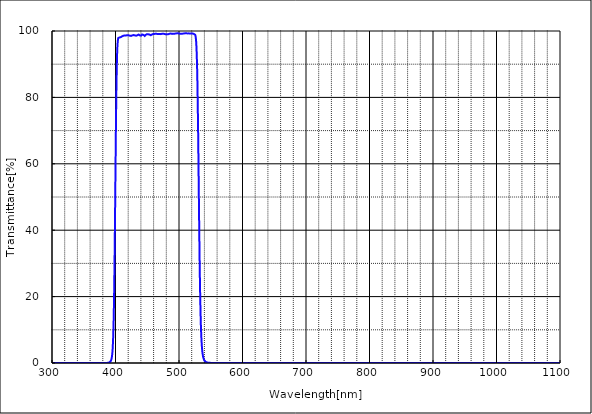
| Category | T% at AOI 0 deg |
|---|---|
| 1100.0 | 0.001 |
| 1099.5 | 0 |
| 1099.0 | 0.001 |
| 1098.5 | 0.003 |
| 1098.0 | 0.001 |
| 1097.5 | 0.001 |
| 1097.0 | 0.002 |
| 1096.5 | 0.002 |
| 1096.0 | 0.002 |
| 1095.5 | 0.003 |
| 1095.0 | 0.002 |
| 1094.5 | 0.003 |
| 1094.0 | 0.002 |
| 1093.5 | 0.002 |
| 1093.0 | 0.002 |
| 1092.5 | 0.002 |
| 1092.0 | 0.002 |
| 1091.5 | 0.002 |
| 1091.0 | 0.002 |
| 1090.5 | 0.001 |
| 1090.0 | 0.003 |
| 1089.5 | 0.002 |
| 1089.0 | 0.002 |
| 1088.5 | 0.002 |
| 1088.0 | 0 |
| 1087.5 | 0.001 |
| 1087.0 | -0.001 |
| 1086.5 | 0.001 |
| 1086.0 | 0.001 |
| 1085.5 | 0.001 |
| 1085.0 | 0 |
| 1084.5 | 0 |
| 1084.0 | 0.002 |
| 1083.5 | 0.001 |
| 1083.0 | 0.001 |
| 1082.5 | 0.001 |
| 1082.0 | 0.001 |
| 1081.5 | 0.001 |
| 1081.0 | 0.001 |
| 1080.5 | 0 |
| 1080.0 | 0.001 |
| 1079.5 | 0 |
| 1079.0 | 0.001 |
| 1078.5 | -0.001 |
| 1078.0 | 0.002 |
| 1077.5 | 0.001 |
| 1077.0 | 0 |
| 1076.5 | 0 |
| 1076.0 | 0 |
| 1075.5 | 0.001 |
| 1075.0 | 0 |
| 1074.5 | 0.001 |
| 1074.0 | 0.001 |
| 1073.5 | -0.001 |
| 1073.0 | 0.001 |
| 1072.5 | 0.001 |
| 1072.0 | 0.002 |
| 1071.5 | 0 |
| 1071.0 | 0.001 |
| 1070.5 | 0 |
| 1070.0 | 0.001 |
| 1069.5 | 0.001 |
| 1069.0 | 0.001 |
| 1068.5 | 0 |
| 1068.0 | 0.001 |
| 1067.5 | 0 |
| 1067.0 | 0.001 |
| 1066.5 | 0.001 |
| 1066.0 | 0.001 |
| 1065.5 | 0.001 |
| 1065.0 | 0 |
| 1064.5 | 0.001 |
| 1064.0 | 0.002 |
| 1063.5 | 0 |
| 1063.0 | 0.001 |
| 1062.5 | -0.001 |
| 1062.0 | 0 |
| 1061.5 | 0 |
| 1061.0 | 0.002 |
| 1060.5 | 0.001 |
| 1060.0 | 0.002 |
| 1059.5 | 0 |
| 1059.0 | -0.002 |
| 1058.5 | 0.001 |
| 1058.0 | 0 |
| 1057.5 | 0 |
| 1057.0 | 0 |
| 1056.5 | 0 |
| 1056.0 | 0.002 |
| 1055.5 | 0.001 |
| 1055.0 | 0 |
| 1054.5 | 0 |
| 1054.0 | 0 |
| 1053.5 | 0.001 |
| 1053.0 | 0 |
| 1052.5 | 0.002 |
| 1052.0 | 0 |
| 1051.5 | 0 |
| 1051.0 | 0.001 |
| 1050.5 | 0 |
| 1050.0 | 0 |
| 1049.5 | 0 |
| 1049.0 | 0.001 |
| 1048.5 | 0.001 |
| 1048.0 | 0 |
| 1047.5 | 0 |
| 1047.0 | 0.001 |
| 1046.5 | 0.001 |
| 1046.0 | 0.001 |
| 1045.5 | 0 |
| 1045.0 | 0.001 |
| 1044.5 | 0.001 |
| 1044.0 | 0.001 |
| 1043.5 | 0.001 |
| 1043.0 | 0.001 |
| 1042.5 | 0 |
| 1042.0 | 0 |
| 1041.5 | 0 |
| 1041.0 | 0 |
| 1040.5 | 0.001 |
| 1040.0 | 0.001 |
| 1039.5 | 0 |
| 1039.0 | 0 |
| 1038.5 | 0 |
| 1038.0 | 0 |
| 1037.5 | 0 |
| 1037.0 | -0.001 |
| 1036.5 | 0 |
| 1036.0 | 0 |
| 1035.5 | 0 |
| 1035.0 | 0 |
| 1034.5 | 0 |
| 1034.0 | 0 |
| 1033.5 | 0.001 |
| 1033.0 | 0.001 |
| 1032.5 | 0 |
| 1032.0 | 0 |
| 1031.5 | 0 |
| 1031.0 | 0 |
| 1030.5 | 0 |
| 1030.0 | 0.001 |
| 1029.5 | 0.002 |
| 1029.0 | -0.001 |
| 1028.5 | 0.001 |
| 1028.0 | 0.001 |
| 1027.5 | 0.001 |
| 1027.0 | 0 |
| 1026.5 | -0.001 |
| 1026.0 | 0.001 |
| 1025.5 | 0.001 |
| 1025.0 | 0 |
| 1024.5 | 0.001 |
| 1024.0 | 0 |
| 1023.5 | 0 |
| 1023.0 | -0.001 |
| 1022.5 | 0 |
| 1022.0 | 0 |
| 1021.5 | 0.001 |
| 1021.0 | 0 |
| 1020.5 | 0 |
| 1020.0 | 0 |
| 1019.5 | 0.001 |
| 1019.0 | 0 |
| 1018.5 | 0 |
| 1018.0 | 0.001 |
| 1017.5 | 0 |
| 1017.0 | 0.001 |
| 1016.5 | 0 |
| 1016.0 | 0 |
| 1015.5 | 0 |
| 1015.0 | 0.001 |
| 1014.5 | 0.002 |
| 1014.0 | 0 |
| 1013.5 | 0.001 |
| 1013.0 | 0.001 |
| 1012.5 | -0.001 |
| 1012.0 | 0 |
| 1011.5 | 0.001 |
| 1011.0 | 0.001 |
| 1010.5 | -0.001 |
| 1010.0 | 0.001 |
| 1009.5 | 0 |
| 1009.0 | -0.001 |
| 1008.5 | 0.001 |
| 1008.0 | 0.001 |
| 1007.5 | 0 |
| 1007.0 | 0.001 |
| 1006.5 | 0.001 |
| 1006.0 | -0.001 |
| 1005.5 | 0 |
| 1005.0 | 0 |
| 1004.5 | 0 |
| 1004.0 | 0.001 |
| 1003.5 | 0 |
| 1003.0 | 0.001 |
| 1002.5 | 0.001 |
| 1002.0 | 0.001 |
| 1001.5 | -0.001 |
| 1001.0 | 0.001 |
| 1000.5 | 0.001 |
| 1000.0 | -0.001 |
| 999.5 | 0 |
| 999.0 | 0 |
| 998.5 | 0 |
| 998.0 | 0.001 |
| 997.5 | 0.001 |
| 997.0 | 0 |
| 996.5 | 0 |
| 996.0 | 0 |
| 995.5 | 0.001 |
| 995.0 | 0 |
| 994.5 | 0.001 |
| 994.0 | 0.001 |
| 993.5 | 0 |
| 993.0 | 0.001 |
| 992.5 | 0.001 |
| 992.0 | 0.001 |
| 991.5 | 0.001 |
| 991.0 | 0 |
| 990.5 | 0.001 |
| 990.0 | 0.001 |
| 989.5 | 0 |
| 989.0 | 0.002 |
| 988.5 | 0.001 |
| 988.0 | -0.001 |
| 987.5 | 0.002 |
| 987.0 | 0.001 |
| 986.5 | 0 |
| 986.0 | -0.001 |
| 985.5 | 0.001 |
| 985.0 | 0.001 |
| 984.5 | -0.001 |
| 984.0 | 0.001 |
| 983.5 | 0.001 |
| 983.0 | -0.001 |
| 982.5 | 0.001 |
| 982.0 | 0.001 |
| 981.5 | 0 |
| 981.0 | 0 |
| 980.5 | 0.001 |
| 980.0 | 0 |
| 979.5 | 0 |
| 979.0 | 0 |
| 978.5 | 0.001 |
| 978.0 | 0 |
| 977.5 | 0 |
| 977.0 | 0 |
| 976.5 | 0.001 |
| 976.0 | 0.001 |
| 975.5 | 0 |
| 975.0 | 0.001 |
| 974.5 | 0.001 |
| 974.0 | 0.001 |
| 973.5 | 0 |
| 973.0 | 0 |
| 972.5 | 0 |
| 972.0 | 0.001 |
| 971.5 | 0 |
| 971.0 | 0 |
| 970.5 | 0 |
| 970.0 | 0 |
| 969.5 | 0 |
| 969.0 | 0 |
| 968.5 | 0 |
| 968.0 | 0 |
| 967.5 | -0.001 |
| 967.0 | -0.001 |
| 966.5 | 0 |
| 966.0 | -0.001 |
| 965.5 | 0.001 |
| 965.0 | -0.001 |
| 964.5 | 0.001 |
| 964.0 | 0 |
| 963.5 | 0 |
| 963.0 | 0.001 |
| 962.5 | 0.001 |
| 962.0 | 0 |
| 961.5 | -0.001 |
| 961.0 | 0.001 |
| 960.5 | 0 |
| 960.0 | 0.002 |
| 959.5 | 0.001 |
| 959.0 | 0.001 |
| 958.5 | 0.001 |
| 958.0 | 0.001 |
| 957.5 | 0.001 |
| 957.0 | 0.001 |
| 956.5 | -0.001 |
| 956.0 | 0 |
| 955.5 | 0 |
| 955.0 | 0 |
| 954.5 | 0 |
| 954.0 | 0.002 |
| 953.5 | 0 |
| 953.0 | 0 |
| 952.5 | 0.001 |
| 952.0 | 0 |
| 951.5 | -0.001 |
| 951.0 | 0.001 |
| 950.5 | 0 |
| 950.0 | -0.001 |
| 949.5 | 0 |
| 949.0 | -0.001 |
| 948.5 | 0 |
| 948.0 | 0 |
| 947.5 | 0.001 |
| 947.0 | 0 |
| 946.5 | 0 |
| 946.0 | 0.001 |
| 945.5 | 0 |
| 945.0 | 0 |
| 944.5 | -0.001 |
| 944.0 | -0.001 |
| 943.5 | 0 |
| 943.0 | 0.001 |
| 942.5 | 0 |
| 942.0 | 0.001 |
| 941.5 | -0.001 |
| 941.0 | 0 |
| 940.5 | 0 |
| 940.0 | 0.002 |
| 939.5 | 0.001 |
| 939.0 | -0.001 |
| 938.5 | 0.001 |
| 938.0 | 0 |
| 937.5 | 0.001 |
| 937.0 | 0 |
| 936.5 | 0 |
| 936.0 | 0 |
| 935.5 | 0 |
| 935.0 | -0.001 |
| 934.5 | 0.001 |
| 934.0 | 0 |
| 933.5 | 0 |
| 933.0 | 0 |
| 932.5 | 0 |
| 932.0 | 0 |
| 931.5 | 0 |
| 931.0 | 0.001 |
| 930.5 | 0.001 |
| 930.0 | 0.001 |
| 929.5 | 0 |
| 929.0 | 0 |
| 928.5 | 0 |
| 928.0 | 0 |
| 927.5 | -0.001 |
| 927.0 | 0.002 |
| 926.5 | 0 |
| 926.0 | 0 |
| 925.5 | 0.001 |
| 925.0 | 0.001 |
| 924.5 | 0.001 |
| 924.0 | 0.002 |
| 923.5 | 0.001 |
| 923.0 | 0.001 |
| 922.5 | 0.001 |
| 922.0 | 0.002 |
| 921.5 | 0 |
| 921.0 | 0.001 |
| 920.5 | 0 |
| 920.0 | 0.001 |
| 919.5 | 0 |
| 919.0 | 0 |
| 918.5 | 0 |
| 918.0 | 0.001 |
| 917.5 | 0.001 |
| 917.0 | 0.001 |
| 916.5 | 0.001 |
| 916.0 | 0.001 |
| 915.5 | 0 |
| 915.0 | 0 |
| 914.5 | 0 |
| 914.0 | 0.001 |
| 913.5 | 0 |
| 913.0 | 0 |
| 912.5 | 0.001 |
| 912.0 | 0 |
| 911.5 | 0 |
| 911.0 | 0 |
| 910.5 | 0 |
| 910.0 | 0.001 |
| 909.5 | 0 |
| 909.0 | 0 |
| 908.5 | 0 |
| 908.0 | 0 |
| 907.5 | 0.001 |
| 907.0 | 0 |
| 906.5 | 0.001 |
| 906.0 | 0 |
| 905.5 | 0.001 |
| 905.0 | 0 |
| 904.5 | 0.001 |
| 904.0 | 0.001 |
| 903.5 | 0.001 |
| 903.0 | 0.001 |
| 902.5 | 0 |
| 902.0 | 0.001 |
| 901.5 | 0.002 |
| 901.0 | 0.001 |
| 900.5 | 0.001 |
| 900.0 | 0 |
| 899.5 | -0.001 |
| 899.0 | 0.001 |
| 898.5 | 0.001 |
| 898.0 | 0.001 |
| 897.5 | 0 |
| 897.0 | 0.001 |
| 896.5 | 0 |
| 896.0 | 0 |
| 895.5 | -0.001 |
| 895.0 | 0 |
| 894.5 | 0 |
| 894.0 | -0.001 |
| 893.5 | 0 |
| 893.0 | 0 |
| 892.5 | 0 |
| 892.0 | 0 |
| 891.5 | 0 |
| 891.0 | 0 |
| 890.5 | -0.001 |
| 890.0 | -0.001 |
| 889.5 | -0.001 |
| 889.0 | 0 |
| 888.5 | 0 |
| 888.0 | 0.001 |
| 887.5 | -0.001 |
| 887.0 | 0 |
| 886.5 | 0 |
| 886.0 | 0 |
| 885.5 | 0 |
| 885.0 | 0 |
| 884.5 | 0 |
| 884.0 | 0.001 |
| 883.5 | 0 |
| 883.0 | -0.001 |
| 882.5 | 0 |
| 882.0 | 0.001 |
| 881.5 | -0.001 |
| 881.0 | 0 |
| 880.5 | 0.001 |
| 880.0 | 0.002 |
| 879.5 | -0.001 |
| 879.0 | 0.002 |
| 878.5 | 0 |
| 878.0 | 0 |
| 877.5 | 0.002 |
| 877.0 | 0 |
| 876.5 | 0.001 |
| 876.0 | 0 |
| 875.5 | 0.001 |
| 875.0 | 0.001 |
| 874.5 | 0 |
| 874.0 | 0 |
| 873.5 | -0.001 |
| 873.0 | 0 |
| 872.5 | 0 |
| 872.0 | 0.002 |
| 871.5 | 0.001 |
| 871.0 | 0 |
| 870.5 | -0.001 |
| 870.0 | 0 |
| 869.5 | 0 |
| 869.0 | -0.001 |
| 868.5 | 0 |
| 868.0 | 0 |
| 867.5 | 0.001 |
| 867.0 | -0.001 |
| 866.5 | 0 |
| 866.0 | -0.001 |
| 865.5 | 0.001 |
| 865.0 | 0 |
| 864.5 | 0.001 |
| 864.0 | 0.001 |
| 863.5 | 0.001 |
| 863.0 | 0.001 |
| 862.5 | 0.001 |
| 862.0 | 0 |
| 861.5 | 0.001 |
| 861.0 | 0 |
| 860.5 | 0.001 |
| 860.0 | 0 |
| 859.5 | 0 |
| 859.0 | 0 |
| 858.5 | 0.001 |
| 858.0 | 0 |
| 857.5 | -0.001 |
| 857.0 | 0 |
| 856.5 | 0 |
| 856.0 | 0.001 |
| 855.5 | 0 |
| 855.0 | 0 |
| 854.5 | 0 |
| 854.0 | -0.001 |
| 853.5 | 0.002 |
| 853.0 | 0 |
| 852.5 | 0.001 |
| 852.0 | 0.002 |
| 851.5 | 0 |
| 851.0 | 0 |
| 850.5 | 0 |
| 850.0 | 0 |
| 849.5 | 0 |
| 849.0 | 0 |
| 848.5 | 0.001 |
| 848.0 | 0 |
| 847.5 | 0 |
| 847.0 | 0 |
| 846.5 | 0 |
| 846.0 | 0 |
| 845.5 | 0 |
| 845.0 | 0 |
| 844.5 | 0 |
| 844.0 | 0 |
| 843.5 | 0 |
| 843.0 | 0 |
| 842.5 | 0 |
| 842.0 | 0 |
| 841.5 | 0 |
| 841.0 | 0 |
| 840.5 | 0 |
| 840.0 | 0 |
| 839.5 | 0 |
| 839.0 | 0 |
| 838.5 | 0 |
| 838.0 | 0 |
| 837.5 | 0 |
| 837.0 | 0 |
| 836.5 | 0 |
| 836.0 | 0 |
| 835.5 | 0 |
| 835.0 | 0 |
| 834.5 | 0 |
| 834.0 | 0 |
| 833.5 | 0 |
| 833.0 | 0 |
| 832.5 | 0 |
| 832.0 | 0 |
| 831.5 | 0 |
| 831.0 | 0 |
| 830.5 | 0 |
| 830.0 | 0 |
| 829.5 | 0 |
| 829.0 | 0 |
| 828.5 | 0 |
| 828.0 | 0 |
| 827.5 | 0 |
| 827.0 | 0 |
| 826.5 | 0 |
| 826.0 | 0 |
| 825.5 | 0 |
| 825.0 | 0 |
| 824.5 | 0 |
| 824.0 | 0 |
| 823.5 | 0 |
| 823.0 | 0 |
| 822.5 | 0 |
| 822.0 | 0 |
| 821.5 | 0 |
| 821.0 | 0 |
| 820.5 | 0 |
| 820.0 | 0 |
| 819.5 | 0 |
| 819.0 | 0 |
| 818.5 | 0 |
| 818.0 | 0 |
| 817.5 | 0 |
| 817.0 | 0 |
| 816.5 | 0 |
| 816.0 | 0 |
| 815.5 | 0 |
| 815.0 | 0 |
| 814.5 | 0 |
| 814.0 | 0 |
| 813.5 | 0 |
| 813.0 | 0 |
| 812.5 | 0 |
| 812.0 | 0 |
| 811.5 | 0 |
| 811.0 | 0 |
| 810.5 | 0 |
| 810.0 | 0 |
| 809.5 | 0 |
| 809.0 | 0 |
| 808.5 | 0 |
| 808.0 | 0 |
| 807.5 | 0 |
| 807.0 | 0 |
| 806.5 | 0 |
| 806.0 | 0.001 |
| 805.5 | 0.001 |
| 805.0 | 0.001 |
| 804.5 | 0.001 |
| 804.0 | 0.001 |
| 803.5 | 0.001 |
| 803.0 | 0.001 |
| 802.5 | 0 |
| 802.0 | 0 |
| 801.5 | 0 |
| 801.0 | 0 |
| 800.5 | 0 |
| 800.0 | 0 |
| 799.5 | 0 |
| 799.0 | 0 |
| 798.5 | 0 |
| 798.0 | 0 |
| 797.5 | 0 |
| 797.0 | 0 |
| 796.5 | 0 |
| 796.0 | 0 |
| 795.5 | 0 |
| 795.0 | 0 |
| 794.5 | 0 |
| 794.0 | 0 |
| 793.5 | 0 |
| 793.0 | 0 |
| 792.5 | 0 |
| 792.0 | 0 |
| 791.5 | 0 |
| 791.0 | 0 |
| 790.5 | 0 |
| 790.0 | 0 |
| 789.5 | 0 |
| 789.0 | 0 |
| 788.5 | 0 |
| 788.0 | 0 |
| 787.5 | 0 |
| 787.0 | 0 |
| 786.5 | 0 |
| 786.0 | 0 |
| 785.5 | 0 |
| 785.0 | 0 |
| 784.5 | 0 |
| 784.0 | 0 |
| 783.5 | 0 |
| 783.0 | 0 |
| 782.5 | 0 |
| 782.0 | 0 |
| 781.5 | 0 |
| 781.0 | 0 |
| 780.5 | 0 |
| 780.0 | 0 |
| 779.5 | 0 |
| 779.0 | 0 |
| 778.5 | 0 |
| 778.0 | 0 |
| 777.5 | 0 |
| 777.0 | 0 |
| 776.5 | 0 |
| 776.0 | 0 |
| 775.5 | 0 |
| 775.0 | 0 |
| 774.5 | 0.001 |
| 774.0 | 0 |
| 773.5 | 0 |
| 773.0 | 0 |
| 772.5 | 0 |
| 772.0 | 0 |
| 771.5 | 0 |
| 771.0 | 0 |
| 770.5 | 0 |
| 770.0 | 0 |
| 769.5 | 0 |
| 769.0 | 0 |
| 768.5 | 0 |
| 768.0 | 0 |
| 767.5 | 0 |
| 767.0 | 0 |
| 766.5 | 0 |
| 766.0 | 0 |
| 765.5 | 0.001 |
| 765.0 | 0 |
| 764.5 | 0.001 |
| 764.0 | 0 |
| 763.5 | 0.001 |
| 763.0 | 0.001 |
| 762.5 | 0.001 |
| 762.0 | 0.001 |
| 761.5 | 0.001 |
| 761.0 | 0.001 |
| 760.5 | 0.001 |
| 760.0 | 0.001 |
| 759.5 | 0.001 |
| 759.0 | 0 |
| 758.5 | 0 |
| 758.0 | 0.001 |
| 757.5 | 0 |
| 757.0 | 0 |
| 756.5 | 0 |
| 756.0 | 0 |
| 755.5 | 0 |
| 755.0 | 0 |
| 754.5 | 0 |
| 754.0 | 0 |
| 753.5 | 0 |
| 753.0 | 0 |
| 752.5 | 0 |
| 752.0 | 0 |
| 751.5 | 0 |
| 751.0 | 0 |
| 750.5 | 0 |
| 750.0 | 0 |
| 749.5 | 0 |
| 749.0 | 0 |
| 748.5 | 0 |
| 748.0 | 0 |
| 747.5 | 0 |
| 747.0 | 0 |
| 746.5 | 0 |
| 746.0 | 0 |
| 745.5 | 0 |
| 745.0 | 0 |
| 744.5 | 0 |
| 744.0 | 0 |
| 743.5 | 0 |
| 743.0 | 0 |
| 742.5 | 0 |
| 742.0 | 0 |
| 741.5 | 0 |
| 741.0 | 0 |
| 740.5 | 0 |
| 740.0 | 0 |
| 739.5 | 0 |
| 739.0 | 0 |
| 738.5 | 0 |
| 738.0 | 0 |
| 737.5 | 0 |
| 737.0 | 0 |
| 736.5 | 0 |
| 736.0 | 0 |
| 735.5 | 0 |
| 735.0 | 0 |
| 734.5 | 0 |
| 734.0 | 0 |
| 733.5 | 0 |
| 733.0 | 0 |
| 732.5 | 0 |
| 732.0 | 0 |
| 731.5 | 0 |
| 731.0 | 0 |
| 730.5 | 0 |
| 730.0 | 0 |
| 729.5 | 0 |
| 729.0 | 0 |
| 728.5 | 0 |
| 728.0 | 0 |
| 727.5 | 0 |
| 727.0 | 0 |
| 726.5 | 0 |
| 726.0 | 0 |
| 725.5 | 0 |
| 725.0 | 0 |
| 724.5 | 0 |
| 724.0 | 0 |
| 723.5 | 0 |
| 723.0 | 0 |
| 722.5 | 0 |
| 722.0 | 0 |
| 721.5 | 0 |
| 721.0 | 0 |
| 720.5 | 0 |
| 720.0 | 0 |
| 719.5 | 0 |
| 719.0 | 0 |
| 718.5 | 0 |
| 718.0 | 0 |
| 717.5 | 0 |
| 717.0 | 0 |
| 716.5 | 0 |
| 716.0 | 0 |
| 715.5 | 0 |
| 715.0 | 0 |
| 714.5 | 0 |
| 714.0 | 0 |
| 713.5 | 0 |
| 713.0 | 0 |
| 712.5 | 0 |
| 712.0 | 0 |
| 711.5 | 0 |
| 711.0 | 0 |
| 710.5 | 0 |
| 710.0 | 0 |
| 709.5 | 0 |
| 709.0 | 0 |
| 708.5 | 0 |
| 708.0 | 0 |
| 707.5 | 0 |
| 707.0 | 0 |
| 706.5 | 0 |
| 706.0 | 0 |
| 705.5 | 0 |
| 705.0 | 0 |
| 704.5 | 0 |
| 704.0 | 0 |
| 703.5 | 0 |
| 703.0 | 0 |
| 702.5 | 0 |
| 702.0 | 0 |
| 701.5 | 0 |
| 701.0 | 0 |
| 700.5 | 0 |
| 700.0 | 0 |
| 699.5 | 0 |
| 699.0 | 0 |
| 698.5 | 0 |
| 698.0 | 0 |
| 697.5 | 0 |
| 697.0 | 0 |
| 696.5 | 0 |
| 696.0 | 0 |
| 695.5 | 0 |
| 695.0 | 0 |
| 694.5 | 0 |
| 694.0 | 0 |
| 693.5 | 0 |
| 693.0 | 0 |
| 692.5 | 0 |
| 692.0 | 0 |
| 691.5 | 0 |
| 691.0 | 0 |
| 690.5 | 0 |
| 690.0 | 0 |
| 689.5 | 0 |
| 689.0 | 0 |
| 688.5 | 0 |
| 688.0 | 0 |
| 687.5 | 0 |
| 687.0 | 0 |
| 686.5 | 0 |
| 686.0 | 0 |
| 685.5 | 0 |
| 685.0 | 0 |
| 684.5 | 0 |
| 684.0 | 0 |
| 683.5 | 0 |
| 683.0 | 0 |
| 682.5 | 0 |
| 682.0 | 0 |
| 681.5 | 0 |
| 681.0 | 0 |
| 680.5 | 0 |
| 680.0 | 0 |
| 679.5 | 0 |
| 679.0 | 0 |
| 678.5 | 0 |
| 678.0 | 0 |
| 677.5 | 0 |
| 677.0 | 0 |
| 676.5 | 0 |
| 676.0 | 0 |
| 675.5 | 0 |
| 675.0 | 0 |
| 674.5 | 0 |
| 674.0 | 0 |
| 673.5 | 0 |
| 673.0 | 0 |
| 672.5 | 0 |
| 672.0 | 0 |
| 671.5 | 0 |
| 671.0 | 0 |
| 670.5 | 0 |
| 670.0 | 0 |
| 669.5 | 0 |
| 669.0 | 0 |
| 668.5 | 0 |
| 668.0 | 0 |
| 667.5 | 0 |
| 667.0 | 0 |
| 666.5 | 0 |
| 666.0 | 0 |
| 665.5 | 0 |
| 665.0 | 0 |
| 664.5 | 0 |
| 664.0 | 0 |
| 663.5 | 0 |
| 663.0 | 0 |
| 662.5 | 0 |
| 662.0 | 0 |
| 661.5 | 0 |
| 661.0 | 0 |
| 660.5 | 0 |
| 660.0 | 0 |
| 659.5 | 0 |
| 659.0 | 0 |
| 658.5 | 0 |
| 658.0 | 0 |
| 657.5 | 0 |
| 657.0 | 0 |
| 656.5 | 0 |
| 656.0 | 0 |
| 655.5 | 0 |
| 655.0 | 0 |
| 654.5 | 0 |
| 654.0 | 0 |
| 653.5 | 0 |
| 653.0 | 0 |
| 652.5 | 0 |
| 652.0 | 0 |
| 651.5 | 0 |
| 651.0 | 0 |
| 650.5 | 0 |
| 650.0 | 0 |
| 649.5 | 0 |
| 649.0 | 0 |
| 648.5 | 0 |
| 648.0 | 0 |
| 647.5 | 0 |
| 647.0 | 0 |
| 646.5 | 0 |
| 646.0 | 0 |
| 645.5 | 0 |
| 645.0 | 0 |
| 644.5 | 0 |
| 644.0 | 0 |
| 643.5 | 0 |
| 643.0 | 0 |
| 642.5 | 0 |
| 642.0 | 0 |
| 641.5 | 0 |
| 641.0 | 0 |
| 640.5 | 0 |
| 640.0 | 0 |
| 639.5 | 0 |
| 639.0 | 0 |
| 638.5 | 0 |
| 638.0 | 0 |
| 637.5 | 0 |
| 637.0 | 0 |
| 636.5 | 0 |
| 636.0 | 0 |
| 635.5 | 0 |
| 635.0 | 0.001 |
| 634.5 | 0 |
| 634.0 | 0 |
| 633.5 | 0 |
| 633.0 | 0 |
| 632.5 | 0.001 |
| 632.0 | 0 |
| 631.5 | 0 |
| 631.0 | 0 |
| 630.5 | 0 |
| 630.0 | 0 |
| 629.5 | 0 |
| 629.0 | 0 |
| 628.5 | 0 |
| 628.0 | 0 |
| 627.5 | 0 |
| 627.0 | 0 |
| 626.5 | 0 |
| 626.0 | 0 |
| 625.5 | 0 |
| 625.0 | 0 |
| 624.5 | 0 |
| 624.0 | 0 |
| 623.5 | 0 |
| 623.0 | 0 |
| 622.5 | 0 |
| 622.0 | 0 |
| 621.5 | 0 |
| 621.0 | 0 |
| 620.5 | 0 |
| 620.0 | 0 |
| 619.5 | 0 |
| 619.0 | 0 |
| 618.5 | 0 |
| 618.0 | 0 |
| 617.5 | 0 |
| 617.0 | 0 |
| 616.5 | 0 |
| 616.0 | 0 |
| 615.5 | 0 |
| 615.0 | 0 |
| 614.5 | 0 |
| 614.0 | 0 |
| 613.5 | 0 |
| 613.0 | 0 |
| 612.5 | 0 |
| 612.0 | 0 |
| 611.5 | 0 |
| 611.0 | 0 |
| 610.5 | 0 |
| 610.0 | 0 |
| 609.5 | 0 |
| 609.0 | 0 |
| 608.5 | 0 |
| 608.0 | 0 |
| 607.5 | 0 |
| 607.0 | 0 |
| 606.5 | 0 |
| 606.0 | 0 |
| 605.5 | 0 |
| 605.0 | 0 |
| 604.5 | 0 |
| 604.0 | 0 |
| 603.5 | 0 |
| 603.0 | 0 |
| 602.5 | 0 |
| 602.0 | 0 |
| 601.5 | 0 |
| 601.0 | 0 |
| 600.5 | 0 |
| 600.0 | 0 |
| 599.5 | 0 |
| 599.0 | 0 |
| 598.5 | 0 |
| 598.0 | 0 |
| 597.5 | 0 |
| 597.0 | 0 |
| 596.5 | 0 |
| 596.0 | 0 |
| 595.5 | 0 |
| 595.0 | 0 |
| 594.5 | 0 |
| 594.0 | 0 |
| 593.5 | 0 |
| 593.0 | 0 |
| 592.5 | 0 |
| 592.0 | 0 |
| 591.5 | 0 |
| 591.0 | 0 |
| 590.5 | 0 |
| 590.0 | 0 |
| 589.5 | 0.001 |
| 589.0 | 0 |
| 588.5 | 0 |
| 588.0 | 0 |
| 587.5 | 0 |
| 587.0 | 0 |
| 586.5 | 0 |
| 586.0 | 0 |
| 585.5 | 0 |
| 585.0 | 0 |
| 584.5 | 0 |
| 584.0 | 0 |
| 583.5 | 0 |
| 583.0 | 0 |
| 582.5 | 0 |
| 582.0 | 0 |
| 581.5 | 0 |
| 581.0 | 0 |
| 580.5 | 0.001 |
| 580.0 | 0 |
| 579.5 | 0 |
| 579.0 | 0 |
| 578.5 | 0 |
| 578.0 | 0 |
| 577.5 | 0 |
| 577.0 | 0 |
| 576.5 | 0 |
| 576.0 | 0 |
| 575.5 | 0 |
| 575.0 | 0 |
| 574.5 | 0 |
| 574.0 | 0 |
| 573.5 | 0.001 |
| 573.0 | 0 |
| 572.5 | 0 |
| 572.0 | 0 |
| 571.5 | 0.001 |
| 571.0 | 0.001 |
| 570.5 | 0.001 |
| 570.0 | 0.001 |
| 569.5 | 0.001 |
| 569.0 | 0.001 |
| 568.5 | 0.001 |
| 568.0 | 0.001 |
| 567.5 | 0.001 |
| 567.0 | 0.001 |
| 566.5 | 0.001 |
| 566.0 | 0.001 |
| 565.5 | 0.001 |
| 565.0 | 0.002 |
| 564.5 | 0.002 |
| 564.0 | 0.002 |
| 563.5 | 0.002 |
| 563.0 | 0.002 |
| 562.5 | 0.002 |
| 562.0 | 0.002 |
| 561.5 | 0.003 |
| 561.0 | 0.003 |
| 560.5 | 0.003 |
| 560.0 | 0.004 |
| 559.5 | 0.004 |
| 559.0 | 0.004 |
| 558.5 | 0.005 |
| 558.0 | 0.005 |
| 557.5 | 0.006 |
| 557.0 | 0.007 |
| 556.5 | 0.007 |
| 556.0 | 0.008 |
| 555.5 | 0.009 |
| 555.0 | 0.01 |
| 554.5 | 0.011 |
| 554.0 | 0.013 |
| 553.5 | 0.014 |
| 553.0 | 0.016 |
| 552.5 | 0.017 |
| 552.0 | 0.02 |
| 551.5 | 0.022 |
| 551.0 | 0.024 |
| 550.5 | 0.028 |
| 550.0 | 0.031 |
| 549.5 | 0.035 |
| 549.0 | 0.04 |
| 548.5 | 0.045 |
| 548.0 | 0.051 |
| 547.5 | 0.059 |
| 547.0 | 0.068 |
| 546.5 | 0.078 |
| 546.0 | 0.09 |
| 545.5 | 0.104 |
| 545.0 | 0.122 |
| 544.5 | 0.143 |
| 544.0 | 0.168 |
| 543.5 | 0.199 |
| 543.0 | 0.237 |
| 542.5 | 0.283 |
| 542.0 | 0.34 |
| 541.5 | 0.412 |
| 541.0 | 0.5 |
| 540.5 | 0.611 |
| 540.0 | 0.753 |
| 539.5 | 0.935 |
| 539.0 | 1.165 |
| 538.5 | 1.467 |
| 538.0 | 1.855 |
| 537.5 | 2.353 |
| 537.0 | 3.025 |
| 536.5 | 3.889 |
| 536.0 | 5.018 |
| 535.5 | 6.57 |
| 535.0 | 8.542 |
| 534.5 | 11.117 |
| 534.0 | 14.544 |
| 533.5 | 18.826 |
| 533.0 | 24.16 |
| 532.5 | 30.606 |
| 532.0 | 37.986 |
| 531.5 | 46.223 |
| 531.0 | 54.765 |
| 530.5 | 63.364 |
| 530.0 | 71.36 |
| 529.5 | 78.443 |
| 529.0 | 84.495 |
| 528.5 | 89.096 |
| 528.0 | 92.581 |
| 527.5 | 95.148 |
| 527.0 | 96.829 |
| 526.5 | 97.891 |
| 526.0 | 98.527 |
| 525.5 | 98.855 |
| 525.0 | 99.004 |
| 524.5 | 99.058 |
| 524.0 | 99.083 |
| 523.5 | 99.109 |
| 523.0 | 99.148 |
| 522.5 | 99.201 |
| 522.0 | 99.227 |
| 521.5 | 99.245 |
| 521.0 | 99.232 |
| 520.5 | 99.223 |
| 520.0 | 99.214 |
| 519.5 | 99.215 |
| 519.0 | 99.239 |
| 518.5 | 99.254 |
| 518.0 | 99.278 |
| 517.5 | 99.277 |
| 517.0 | 99.279 |
| 516.5 | 99.263 |
| 516.0 | 99.26 |
| 515.5 | 99.285 |
| 515.0 | 99.302 |
| 514.5 | 99.31 |
| 514.0 | 99.294 |
| 513.5 | 99.28 |
| 513.0 | 99.297 |
| 512.5 | 99.289 |
| 512.0 | 99.279 |
| 511.5 | 99.29 |
| 511.0 | 99.29 |
| 510.5 | 99.297 |
| 510.0 | 99.3 |
| 509.5 | 99.306 |
| 509.0 | 99.3 |
| 508.5 | 99.295 |
| 508.0 | 99.284 |
| 507.5 | 99.255 |
| 507.0 | 99.244 |
| 506.5 | 99.225 |
| 506.0 | 99.205 |
| 505.5 | 99.195 |
| 505.0 | 99.183 |
| 504.5 | 99.176 |
| 504.0 | 99.161 |
| 503.5 | 99.148 |
| 503.0 | 99.165 |
| 502.5 | 99.161 |
| 502.0 | 99.18 |
| 501.5 | 99.188 |
| 501.0 | 99.204 |
| 500.5 | 99.218 |
| 500.0 | 99.242 |
| 499.5 | 99.269 |
| 499.0 | 99.272 |
| 498.5 | 99.288 |
| 498.0 | 99.304 |
| 497.5 | 99.308 |
| 497.0 | 99.307 |
| 496.5 | 99.305 |
| 496.0 | 99.289 |
| 495.5 | 99.277 |
| 495.0 | 99.251 |
| 494.5 | 99.24 |
| 494.0 | 99.222 |
| 493.5 | 99.207 |
| 493.0 | 99.212 |
| 492.5 | 99.185 |
| 492.0 | 99.178 |
| 491.5 | 99.161 |
| 491.0 | 99.136 |
| 490.5 | 99.12 |
| 490.0 | 99.122 |
| 489.5 | 99.132 |
| 489.0 | 99.136 |
| 488.5 | 99.164 |
| 488.0 | 99.193 |
| 487.5 | 99.215 |
| 487.0 | 99.222 |
| 486.5 | 99.222 |
| 486.0 | 99.217 |
| 485.5 | 99.205 |
| 485.0 | 99.203 |
| 484.5 | 99.161 |
| 484.0 | 99.106 |
| 483.5 | 99.068 |
| 483.0 | 99.019 |
| 482.5 | 99.003 |
| 482.0 | 99.008 |
| 481.5 | 99 |
| 481.0 | 99.021 |
| 480.5 | 99.016 |
| 480.0 | 99.007 |
| 479.5 | 99 |
| 479.0 | 99.002 |
| 478.5 | 99.021 |
| 478.0 | 99.058 |
| 477.5 | 99.083 |
| 477.0 | 99.132 |
| 476.5 | 99.178 |
| 476.0 | 99.188 |
| 475.5 | 99.208 |
| 475.0 | 99.225 |
| 474.5 | 99.235 |
| 474.0 | 99.228 |
| 473.5 | 99.186 |
| 473.0 | 99.146 |
| 472.5 | 99.101 |
| 472.0 | 99.069 |
| 471.5 | 99.054 |
| 471.0 | 99.079 |
| 470.5 | 99.105 |
| 470.0 | 99.109 |
| 469.5 | 99.121 |
| 469.0 | 99.122 |
| 468.5 | 99.114 |
| 468.0 | 99.123 |
| 467.5 | 99.125 |
| 467.0 | 99.123 |
| 466.5 | 99.125 |
| 466.0 | 99.111 |
| 465.5 | 99.122 |
| 465.0 | 99.134 |
| 464.5 | 99.163 |
| 464.0 | 99.218 |
| 463.5 | 99.208 |
| 463.0 | 99.182 |
| 462.5 | 99.144 |
| 462.0 | 99.134 |
| 461.5 | 99.121 |
| 461.0 | 99.128 |
| 460.5 | 99.129 |
| 460.0 | 99.12 |
| 459.5 | 99.11 |
| 459.0 | 99.095 |
| 458.5 | 99.095 |
| 458.0 | 99.04 |
| 457.5 | 98.96 |
| 457.0 | 98.892 |
| 456.5 | 98.811 |
| 456.0 | 98.748 |
| 455.5 | 98.73 |
| 455.0 | 98.749 |
| 454.5 | 98.812 |
| 454.0 | 98.874 |
| 453.5 | 98.941 |
| 453.0 | 99.007 |
| 452.5 | 99.003 |
| 452.0 | 99.005 |
| 451.5 | 99.008 |
| 451.0 | 99.032 |
| 450.5 | 99.052 |
| 450.0 | 99.045 |
| 449.5 | 99.034 |
| 449.0 | 99.014 |
| 448.5 | 98.981 |
| 448.0 | 98.951 |
| 447.5 | 98.83 |
| 447.0 | 98.683 |
| 446.5 | 98.574 |
| 446.0 | 98.52 |
| 445.5 | 98.537 |
| 445.0 | 98.622 |
| 444.5 | 98.722 |
| 444.0 | 98.834 |
| 443.5 | 98.912 |
| 443.0 | 98.991 |
| 442.5 | 99.013 |
| 442.0 | 98.957 |
| 441.5 | 98.866 |
| 441.0 | 98.731 |
| 440.5 | 98.615 |
| 440.0 | 98.543 |
| 439.5 | 98.548 |
| 439.0 | 98.601 |
| 438.5 | 98.668 |
| 438.0 | 98.763 |
| 437.5 | 98.829 |
| 437.0 | 98.864 |
| 436.5 | 98.926 |
| 436.0 | 98.937 |
| 435.5 | 98.911 |
| 435.0 | 98.844 |
| 434.5 | 98.75 |
| 434.0 | 98.673 |
| 433.5 | 98.623 |
| 433.0 | 98.582 |
| 432.5 | 98.575 |
| 432.0 | 98.587 |
| 431.5 | 98.589 |
| 431.0 | 98.63 |
| 430.5 | 98.69 |
| 430.0 | 98.723 |
| 429.5 | 98.755 |
| 429.0 | 98.769 |
| 428.5 | 98.776 |
| 428.0 | 98.778 |
| 427.5 | 98.764 |
| 427.0 | 98.728 |
| 426.5 | 98.683 |
| 426.0 | 98.636 |
| 425.5 | 98.583 |
| 425.0 | 98.552 |
| 424.5 | 98.52 |
| 424.0 | 98.548 |
| 423.5 | 98.55 |
| 423.0 | 98.561 |
| 422.5 | 98.592 |
| 422.0 | 98.649 |
| 421.5 | 98.676 |
| 421.0 | 98.716 |
| 420.5 | 98.719 |
| 420.0 | 98.731 |
| 419.5 | 98.732 |
| 419.0 | 98.711 |
| 418.5 | 98.721 |
| 418.0 | 98.706 |
| 417.5 | 98.693 |
| 417.0 | 98.679 |
| 416.5 | 98.66 |
| 416.0 | 98.646 |
| 415.5 | 98.651 |
| 415.0 | 98.649 |
| 414.5 | 98.657 |
| 414.0 | 98.658 |
| 413.5 | 98.634 |
| 413.0 | 98.608 |
| 412.5 | 98.583 |
| 412.0 | 98.574 |
| 411.5 | 98.521 |
| 411.0 | 98.469 |
| 410.5 | 98.413 |
| 410.0 | 98.34 |
| 409.5 | 98.253 |
| 409.0 | 98.232 |
| 408.5 | 98.165 |
| 408.0 | 98.11 |
| 407.5 | 98.068 |
| 407.0 | 98.039 |
| 406.5 | 98.055 |
| 406.0 | 98.101 |
| 405.5 | 98.13 |
| 405.0 | 98.08 |
| 404.5 | 97.925 |
| 404.0 | 97.573 |
| 403.5 | 96.788 |
| 403.0 | 95.375 |
| 402.5 | 92.952 |
| 402.0 | 89.049 |
| 401.5 | 83.643 |
| 401.0 | 76.564 |
| 400.5 | 67.949 |
| 400.0 | 58.37 |
| 399.5 | 48.443 |
| 399.0 | 38.96 |
| 398.5 | 30.316 |
| 398.0 | 22.952 |
| 397.5 | 16.988 |
| 397.0 | 12.213 |
| 396.5 | 8.675 |
| 396.0 | 6.106 |
| 395.5 | 4.206 |
| 395.0 | 2.946 |
| 394.5 | 2.073 |
| 394.0 | 1.459 |
| 393.5 | 1.052 |
| 393.0 | 0.772 |
| 392.5 | 0.573 |
| 392.0 | 0.436 |
| 391.5 | 0.336 |
| 391.0 | 0.261 |
| 390.5 | 0.205 |
| 390.0 | 0.161 |
| 389.5 | 0.126 |
| 389.0 | 0.098 |
| 388.5 | 0.076 |
| 388.0 | 0.058 |
| 387.5 | 0.044 |
| 387.0 | 0.033 |
| 386.5 | 0.025 |
| 386.0 | 0.018 |
| 385.5 | 0.014 |
| 385.0 | 0.011 |
| 384.5 | 0.008 |
| 384.0 | 0.007 |
| 383.5 | 0.006 |
| 383.0 | 0.005 |
| 382.5 | 0.004 |
| 382.0 | 0.003 |
| 381.5 | 0.003 |
| 381.0 | 0.003 |
| 380.5 | 0.002 |
| 380.0 | 0.001 |
| 379.5 | 0.001 |
| 379.0 | 0 |
| 378.5 | 0 |
| 378.0 | 0 |
| 377.5 | 0 |
| 377.0 | 0 |
| 376.5 | 0 |
| 376.0 | 0 |
| 375.5 | 0 |
| 375.0 | 0 |
| 374.5 | 0 |
| 374.0 | 0 |
| 373.5 | 0 |
| 373.0 | 0 |
| 372.5 | 0 |
| 372.0 | 0 |
| 371.5 | 0 |
| 371.0 | 0 |
| 370.5 | 0 |
| 370.0 | 0 |
| 369.5 | 0 |
| 369.0 | 0 |
| 368.5 | 0 |
| 368.0 | 0 |
| 367.5 | 0 |
| 367.0 | 0 |
| 366.5 | 0 |
| 366.0 | 0 |
| 365.5 | 0 |
| 365.0 | 0 |
| 364.5 | 0 |
| 364.0 | 0 |
| 363.5 | 0 |
| 363.0 | 0 |
| 362.5 | 0 |
| 362.0 | 0 |
| 361.5 | 0 |
| 361.0 | 0 |
| 360.5 | 0 |
| 360.0 | 0 |
| 359.5 | 0 |
| 359.0 | 0 |
| 358.5 | 0 |
| 358.0 | 0 |
| 357.5 | 0 |
| 357.0 | 0 |
| 356.5 | 0 |
| 356.0 | 0 |
| 355.5 | 0 |
| 355.0 | 0 |
| 354.5 | 0 |
| 354.0 | 0 |
| 353.5 | 0 |
| 353.0 | 0 |
| 352.5 | 0 |
| 352.0 | 0 |
| 351.5 | 0 |
| 351.0 | 0 |
| 350.5 | 0 |
| 350.0 | 0 |
| 349.5 | 0 |
| 349.0 | 0 |
| 348.5 | 0 |
| 348.0 | 0 |
| 347.5 | 0 |
| 347.0 | 0 |
| 346.5 | 0 |
| 346.0 | 0 |
| 345.5 | 0 |
| 345.0 | 0 |
| 344.5 | 0 |
| 344.0 | 0 |
| 343.5 | 0 |
| 343.0 | 0 |
| 342.5 | 0 |
| 342.0 | 0 |
| 341.5 | 0 |
| 341.0 | 0 |
| 340.5 | 0 |
| 340.0 | 0 |
| 339.5 | 0 |
| 339.0 | 0 |
| 338.5 | 0 |
| 338.0 | 0 |
| 337.5 | 0 |
| 337.0 | 0 |
| 336.5 | 0 |
| 336.0 | 0 |
| 335.5 | 0 |
| 335.0 | 0 |
| 334.5 | 0 |
| 334.0 | 0 |
| 333.5 | 0 |
| 333.0 | 0 |
| 332.5 | 0 |
| 332.0 | 0 |
| 331.5 | 0 |
| 331.0 | 0 |
| 330.5 | 0 |
| 330.0 | 0 |
| 329.5 | 0 |
| 329.0 | 0 |
| 328.5 | 0 |
| 328.0 | 0 |
| 327.5 | 0 |
| 327.0 | 0 |
| 326.5 | 0 |
| 326.0 | 0 |
| 325.5 | 0 |
| 325.0 | 0 |
| 324.5 | 0 |
| 324.0 | 0 |
| 323.5 | 0 |
| 323.0 | 0 |
| 322.5 | 0 |
| 322.0 | 0 |
| 321.5 | 0 |
| 321.0 | 0 |
| 320.5 | 0 |
| 320.0 | 0 |
| 319.5 | 0 |
| 319.0 | 0 |
| 318.5 | 0 |
| 318.0 | 0 |
| 317.5 | 0 |
| 317.0 | 0 |
| 316.5 | 0 |
| 316.0 | 0 |
| 315.5 | 0 |
| 315.0 | 0 |
| 314.5 | 0 |
| 314.0 | 0 |
| 313.5 | 0 |
| 313.0 | 0 |
| 312.5 | 0 |
| 312.0 | 0 |
| 311.5 | 0 |
| 311.0 | 0 |
| 310.5 | 0 |
| 310.0 | 0 |
| 309.5 | 0 |
| 309.0 | 0 |
| 308.5 | 0 |
| 308.0 | 0 |
| 307.5 | 0 |
| 307.0 | 0 |
| 306.5 | 0 |
| 306.0 | 0 |
| 305.5 | 0 |
| 305.0 | 0 |
| 304.5 | 0 |
| 304.0 | 0 |
| 303.5 | 0 |
| 303.0 | 0 |
| 302.5 | 0 |
| 302.0 | 0 |
| 301.5 | 0 |
| 301.0 | 0 |
| 300.5 | 0 |
| 300.0 | 0 |